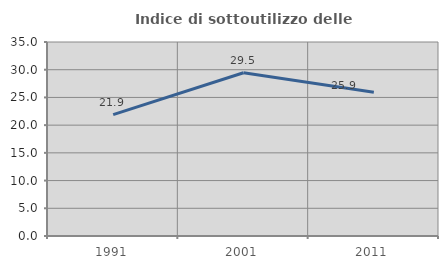
| Category | Indice di sottoutilizzo delle abitazioni  |
|---|---|
| 1991.0 | 21.891 |
| 2001.0 | 29.457 |
| 2011.0 | 25.937 |